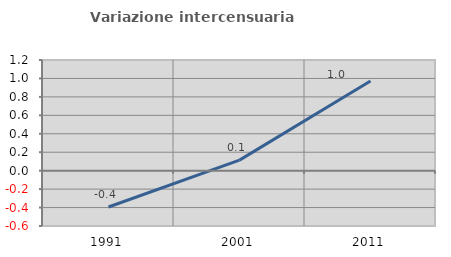
| Category | Variazione intercensuaria annua |
|---|---|
| 1991.0 | -0.394 |
| 2001.0 | 0.114 |
| 2011.0 | 0.972 |